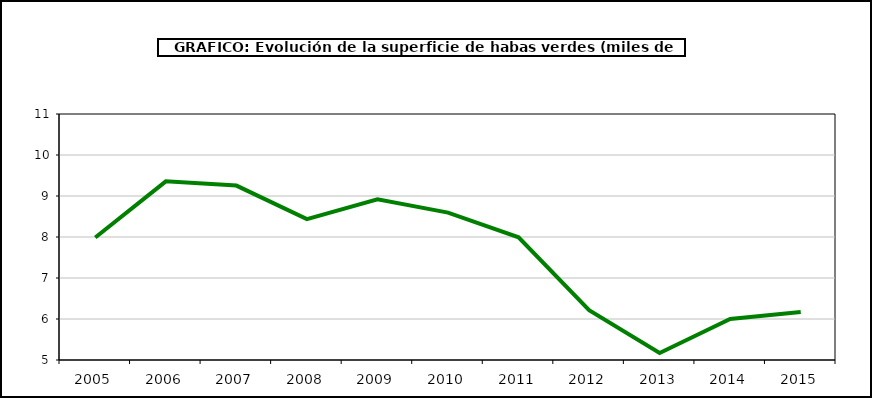
| Category | superficie |
|---|---|
| 2005.0 | 7.989 |
| 2006.0 | 9.358 |
| 2007.0 | 9.254 |
| 2008.0 | 8.436 |
| 2009.0 | 8.92 |
| 2010.0 | 8.595 |
| 2011.0 | 7.993 |
| 2012.0 | 6.216 |
| 2013.0 | 5.17 |
| 2014.0 | 6.001 |
| 2015.0 | 6.169 |